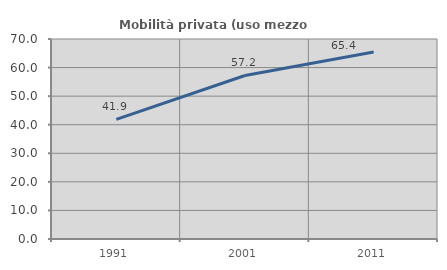
| Category | Mobilità privata (uso mezzo privato) |
|---|---|
| 1991.0 | 41.853 |
| 2001.0 | 57.228 |
| 2011.0 | 65.417 |